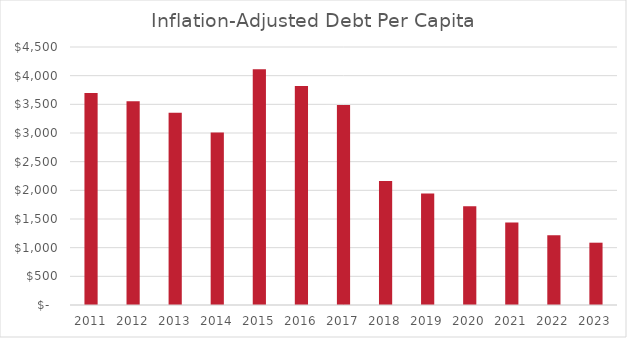
| Category | Inflation-Adjusted Debt Per Capita |
|---|---|
| 2011.0 | 3699.412 |
| 2012.0 | 3551.709 |
| 2013.0 | 3352.03 |
| 2014.0 | 3010.286 |
| 2015.0 | 4111.204 |
| 2016.0 | 3820.248 |
| 2017.0 | 3488.153 |
| 2018.0 | 2162.849 |
| 2019.0 | 1944.698 |
| 2020.0 | 1722.103 |
| 2021.0 | 1439.434 |
| 2022.0 | 1218.31 |
| 2023.0 | 1086.744 |